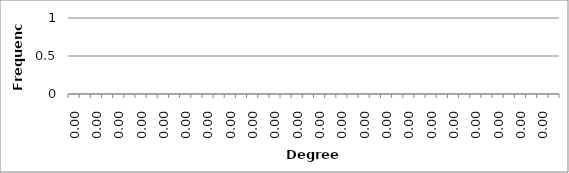
| Category | Series 0 |
|---|---|
| 0.0 | 0 |
| 0.0 | 0 |
| 0.0 | 0 |
| 0.0 | 0 |
| 0.0 | 0 |
| 0.0 | 0 |
| 0.0 | 0 |
| 0.0 | 0 |
| 0.0 | 0 |
| 0.0 | 0 |
| 0.0 | 0 |
| 0.0 | 0 |
| 0.0 | 0 |
| 0.0 | 0 |
| 0.0 | 0 |
| 0.0 | 0 |
| 0.0 | 0 |
| 0.0 | 0 |
| 0.0 | 0 |
| 0.0 | 0 |
| 0.0 | 0 |
| 0.0 | 0 |
| 0.0 | 0 |
| 0.0 | 0 |
| 0.0 | 0 |
| 0.0 | 0 |
| 0.0 | 0 |
| 0.0 | 0 |
| 0.0 | 0 |
| 0.0 | 0 |
| 0.0 | 0 |
| 0.0 | 0 |
| 0.0 | 0 |
| 0.0 | 0 |
| 0.0 | 0 |
| 0.0 | 0 |
| 0.0 | 0 |
| 0.0 | 0 |
| 0.0 | 0 |
| 0.0 | 0 |
| 0.0 | 0 |
| 0.0 | 0 |
| 0.0 | 0 |
| 0.0 | 0 |